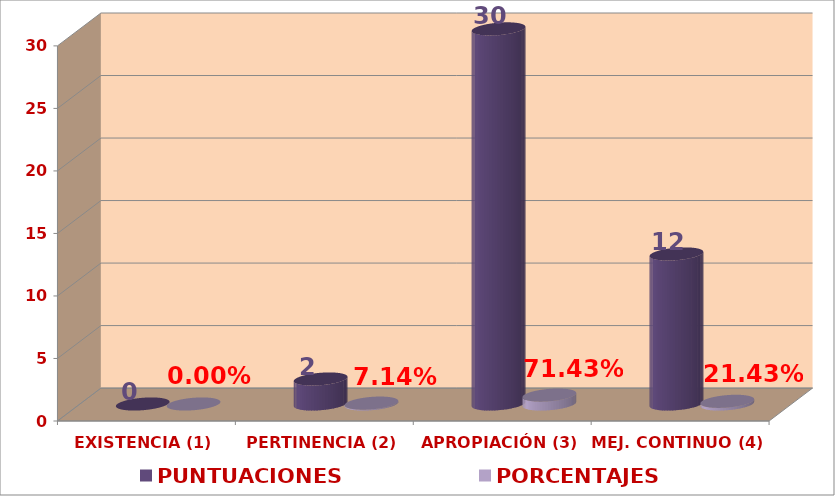
| Category | PUNTUACIONES | PORCENTAJES |
|---|---|---|
| EXISTENCIA (1) | 0 | 0 |
| PERTINENCIA (2) | 2 | 0.071 |
| APROPIACIÓN (3) | 30 | 0.714 |
| MEJ. CONTINUO (4) | 12 | 0.214 |